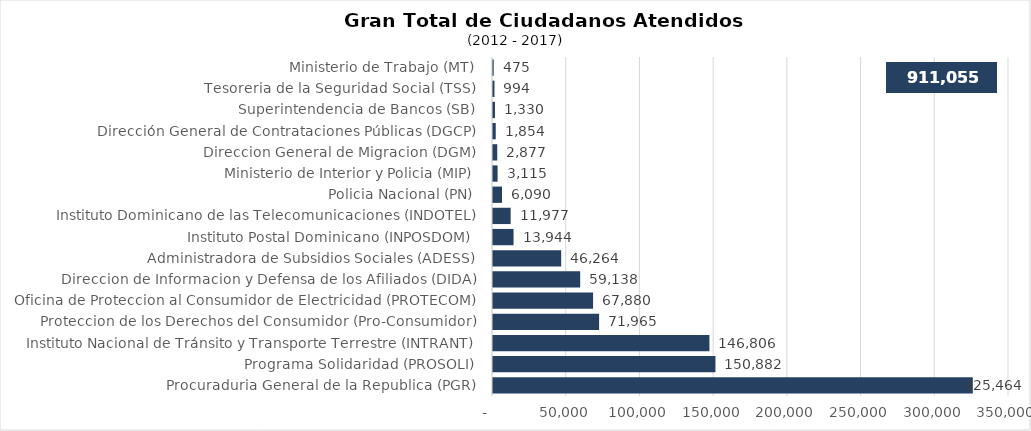
| Category | Series 0 |
|---|---|
| Procuraduria General de la Republica (PGR) | 325464 |
| Programa Solidaridad (PROSOLI) | 150882 |
| Instituto Nacional de Tránsito y Transporte Terrestre (INTRANT) | 146806 |
| Proteccion de los Derechos del Consumidor (Pro-Consumidor) | 71965 |
| Oficina de Proteccion al Consumidor de Electricidad (PROTECOM) | 67880 |
| Direccion de Informacion y Defensa de los Afiliados (DIDA) | 59138 |
| Administradora de Subsidios Sociales (ADESS) | 46264 |
| Instituto Postal Dominicano (INPOSDOM) | 13944 |
| Instituto Dominicano de las Telecomunicaciones (INDOTEL) | 11977 |
| Policia Nacional (PN) | 6090 |
| Ministerio de Interior y Policia (MIP) | 3115 |
| Direccion General de Migracion (DGM) | 2877 |
| Dirección General de Contrataciones Públicas (DGCP) | 1854 |
| Superintendencia de Bancos (SB) | 1330 |
| Tesoreria de la Seguridad Social (TSS) | 994 |
| Ministerio de Trabajo (MT) | 475 |